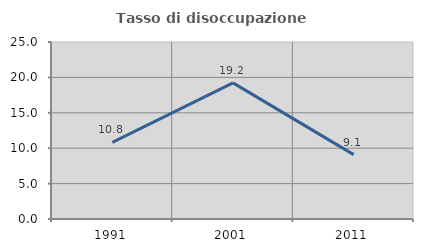
| Category | Tasso di disoccupazione giovanile  |
|---|---|
| 1991.0 | 10.811 |
| 2001.0 | 19.231 |
| 2011.0 | 9.091 |